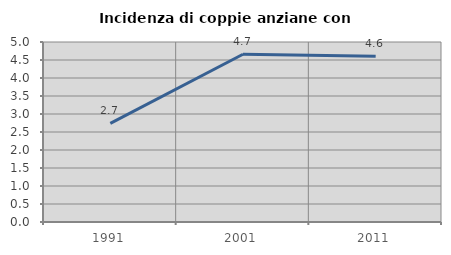
| Category | Incidenza di coppie anziane con figli |
|---|---|
| 1991.0 | 2.74 |
| 2001.0 | 4.66 |
| 2011.0 | 4.602 |